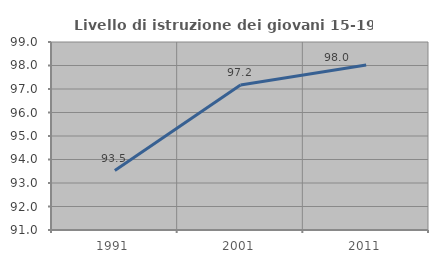
| Category | Livello di istruzione dei giovani 15-19 anni |
|---|---|
| 1991.0 | 93.529 |
| 2001.0 | 97.166 |
| 2011.0 | 98.024 |